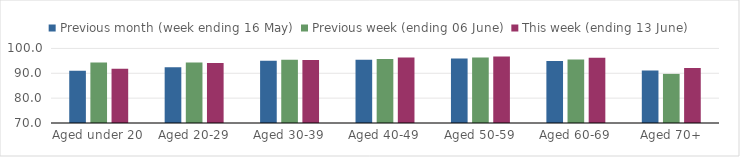
| Category | Previous month (week ending 16 May) | Previous week (ending 06 June) | This week (ending 13 June) |
|---|---|---|---|
| Aged under 20 | 91.047 | 94.388 | 91.806 |
| Aged 20-29 | 92.42 | 94.335 | 94.124 |
| Aged 30-39 | 94.996 | 95.453 | 95.296 |
| Aged 40-49 | 95.483 | 95.754 | 96.366 |
| Aged 50-59 | 95.949 | 96.36 | 96.713 |
| Aged 60-69 | 94.954 | 95.531 | 96.225 |
| Aged 70+ | 91.146 | 89.757 | 92.149 |